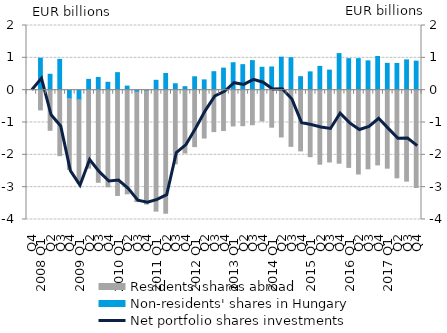
| Category | Non-residents' shares in Hungary | Residents' shares abroad |
|---|---|---|
| Q4 | 0 | 0 |
| 2008 Q1 | 0.989 | -0.61 |
| Q2 | 0.491 | -1.241 |
| Q3 | 0.953 | -2.026 |
| Q4 | -0.26 | -2.191 |
| 2009 Q1 | -0.294 | -2.579 |
| Q2 | 0.334 | -2.411 |
| Q3 | 0.393 | -2.848 |
| Q4 | 0.244 | -2.989 |
| 2010 Q1 | 0.541 | -3.256 |
| Q2 | 0.126 | -3.206 |
| Q3 | -0.059 | -3.388 |
| Q4 | -0.025 | -3.498 |
| 2011 Q1 | 0.305 | -3.742 |
| Q2 | 0.516 | -3.806 |
| Q3 | 0.199 | -2.28 |
| Q4 | 0.108 | -1.944 |
| 2012 Q1 | 0.414 | -1.746 |
| Q2 | 0.318 | -1.481 |
| Q3 | 0.572 | -1.282 |
| Q4 | 0.681 | -1.249 |
| 2013 Q1 | 0.848 | -1.107 |
| Q2 | 0.789 | -1.099 |
| Q3 | 0.914 | -1.07 |
| Q4 | 0.708 | -0.952 |
| 2014 Q1 | 0.717 | -1.146 |
| Q2 | 1.02 | -1.447 |
| Q3 | 1.004 | -1.738 |
| Q4 | 0.418 | -1.879 |
| 2015 Q1 | 0.566 | -2.057 |
| Q2 | 0.735 | -2.29 |
| Q3 | 0.62 | -2.222 |
| Q4 | 1.131 | -2.259 |
| 2016 Q1 | 0.975 | -2.388 |
| Q2 | 0.975 | -2.593 |
| Q3 | 0.907 | -2.431 |
| Q4 | 1.041 | -2.311 |
| 2017 Q1 | 0.83 | -2.412 |
| Q2 | 0.825 | -2.711 |
| Q3 | 0.937 | -2.813 |
| Q4 | 0.897 | -3.01 |